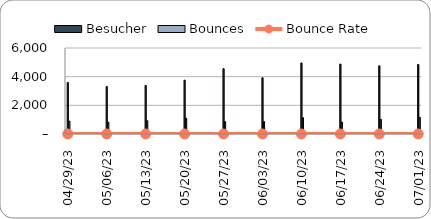
| Category | Besucher | Bounces |
|---|---|---|
| 2023-07-01 | 4852.664 | 1167.311 |
| 2023-06-24 | 4756.677 | 1023.126 |
| 2023-06-17 | 4880.048 | 831.787 |
| 2023-06-10 | 4957.128 | 1140.139 |
| 2023-06-03 | 3923.253 | 872.924 |
| 2023-05-27 | 4556.259 | 863.58 |
| 2023-05-20 | 3756.24 | 1103.917 |
| 2023-05-13 | 3385.719 | 930.66 |
| 2023-05-06 | 3308.631 | 826.749 |
| 2023-04-29 | 3596.495 | 901.548 |